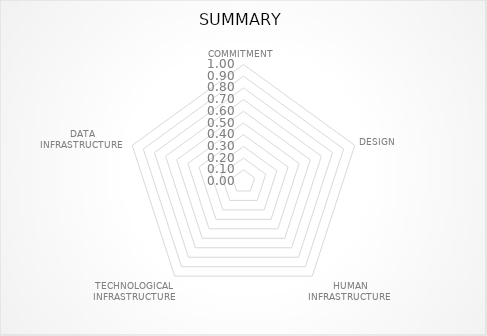
| Category | Average Scores |
|---|---|
| COMMITMENT | 0 |
| DESIGN | 0 |
| HUMAN INFRASTRUCTURE | 0 |
| TECHNOLOGICAL INFRASTRUCTURE | 0 |
| DATA INFRASTRUCTURE | 0 |